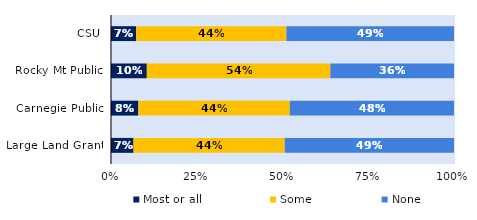
| Category | Most or all | Some | None |
|---|---|---|---|
| CSU | 0.073 | 0.438 | 0.489 |
| Rocky Mt Public | 0.104 | 0.535 | 0.36 |
| Carnegie Public | 0.08 | 0.441 | 0.479 |
| Large Land Grant | 0.066 | 0.441 | 0.494 |